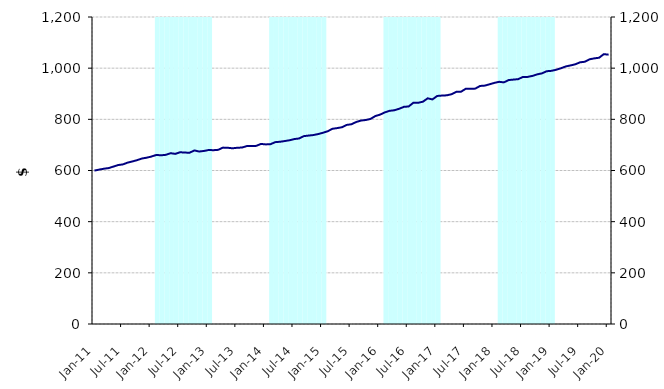
| Category | Series 1 |
|---|---|
| 0 | 0 |
| 1900-01-01 | 0 |
| 1900-01-02 | 0 |
| 1900-01-03 | 0 |
| 1900-01-04 | 0 |
| 1900-01-05 | 0 |
| 1900-01-06 | 0 |
| 1900-01-07 | 0 |
| 1900-01-08 | 0 |
| 1900-01-09 | 0 |
| 1900-01-10 | 0 |
| 1900-01-11 | 0 |
| 1900-01-12 | 0 |
| 1900-01-13 | 1200000000 |
| 1900-01-14 | 1200000000 |
| 1900-01-15 | 1200000000 |
| 1900-01-16 | 1200000000 |
| 1900-01-17 | 1200000000 |
| 1900-01-18 | 1200000000 |
| 1900-01-19 | 1200000000 |
| 1900-01-20 | 1200000000 |
| 1900-01-21 | 1200000000 |
| 1900-01-22 | 1200000000 |
| 1900-01-23 | 1200000000 |
| 1900-01-24 | 1200000000 |
| 1900-01-25 | 0 |
| 1900-01-26 | 0 |
| 1900-01-27 | 0 |
| 1900-01-28 | 0 |
| 1900-01-29 | 0 |
| 1900-01-30 | 0 |
| 1900-01-31 | 0 |
| 1900-02-01 | 0 |
| 1900-02-02 | 0 |
| 1900-02-03 | 0 |
| 1900-02-04 | 0 |
| 1900-02-05 | 0 |
| 1900-02-06 | 1200000000 |
| 1900-02-07 | 1200000000 |
| 1900-02-08 | 1200000000 |
| 1900-02-09 | 1200000000 |
| 1900-02-10 | 1200000000 |
| 1900-02-11 | 1200000000 |
| 1900-02-12 | 1200000000 |
| 1900-02-13 | 1200000000 |
| 1900-02-14 | 1200000000 |
| 1900-02-15 | 1200000000 |
| 1900-02-16 | 1200000000 |
| 1900-02-17 | 1200000000 |
| 1900-02-18 | 0 |
| 1900-02-19 | 0 |
| 1900-02-20 | 0 |
| 1900-02-21 | 0 |
| 1900-02-22 | 0 |
| 1900-02-23 | 0 |
| 1900-02-24 | 0 |
| 1900-02-25 | 0 |
| 1900-02-26 | 0 |
| 1900-02-27 | 0 |
| 1900-02-28 | 0 |
| 1900-02-28 | 0 |
| 1900-03-01 | 1200000000 |
| 1900-03-02 | 1200000000 |
| 1900-03-03 | 1200000000 |
| 1900-03-04 | 1200000000 |
| 1900-03-05 | 1200000000 |
| 1900-03-06 | 1200000000 |
| 1900-03-07 | 1200000000 |
| 1900-03-08 | 1200000000 |
| 1900-03-09 | 1200000000 |
| 1900-03-10 | 1200000000 |
| 1900-03-11 | 1200000000 |
| 1900-03-12 | 1200000000 |
| 1900-03-13 | 0 |
| 1900-03-14 | 0 |
| 1900-03-15 | 0 |
| 1900-03-16 | 0 |
| 1900-03-17 | 0 |
| 1900-03-18 | 0 |
| 1900-03-19 | 0 |
| 1900-03-20 | 0 |
| 1900-03-21 | 0 |
| 1900-03-22 | 0 |
| 1900-03-23 | 0 |
| 1900-03-24 | 0 |
| 1900-03-25 | 1200000000 |
| 1900-03-26 | 1200000000 |
| 1900-03-27 | 1200000000 |
| 1900-03-28 | 1200000000 |
| 1900-03-29 | 1200000000 |
| 1900-03-30 | 1200000000 |
| 1900-03-31 | 1200000000 |
| 1900-04-01 | 1200000000 |
| 1900-04-02 | 1200000000 |
| 1900-04-03 | 1200000000 |
| 1900-04-04 | 1200000000 |
| 1900-04-05 | 1200000000 |
| 1900-04-06 | 0 |
| 1900-04-07 | 0 |
| 1900-04-08 | 0 |
| 1900-04-09 | 0 |
| 1900-04-10 | 0 |
| 1900-04-11 | 0 |
| 1900-04-12 | 0 |
| 1900-04-13 | 0 |
| 1900-04-14 | 0 |
| 1900-04-15 | 0 |
| 1900-04-16 | 0 |
| 1900-04-17 | 0 |